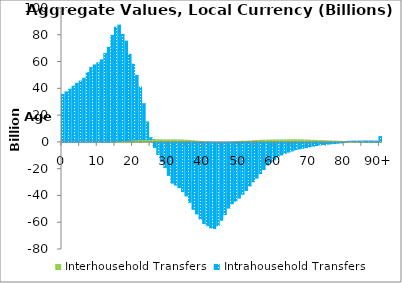
| Category | Interhousehold Transfers | Intrahousehold Transfers |
|---|---|---|
| 0 | 0 | 35751.461 |
|  | 0 | 37716.312 |
| 2 | 0 | 39720.947 |
| 3 | 0 | 41975.771 |
| 4 | 0 | 44111.616 |
| 5 | 0 | 45813.739 |
| 6 | 0 | 47883.233 |
| 7 | 0 | 52155.057 |
| 8 | 0 | 55840.398 |
| 9 | 0 | 57887.775 |
| 10 | 0 | 59434.502 |
| 11 | 0 | 61644.762 |
| 12 | 58.125 | 66401.333 |
| 13 | 124.232 | 70904.792 |
| 14 | 264.367 | 79694.11 |
| 15 | 475.03 | 85583.53 |
| 16 | 754.646 | 86840.67 |
| 17 | 1024.36 | 79652.402 |
| 18 | 1270.335 | 74351.024 |
| 19 | 1542.965 | 64181.14 |
| 20 | 1822.283 | 56574.491 |
| 21 | 1998.437 | 48045.274 |
| 22 | 2088.601 | 39201.676 |
| 23 | 2126.765 | 26825.713 |
| 24 | 2137.882 | 13123.959 |
| 25 | 2136.284 | 1372.672 |
| 26 | 2103.991 | -3740.96 |
| 27 | 2036.01 | -9044.374 |
| 28 | 1952.44 | -14371.701 |
| 29 | 1886.834 | -18816.327 |
| 30 | 1894.533 | -24655.974 |
| 31 | 1923.094 | -30453.542 |
| 32 | 1945.813 | -31866.468 |
| 33 | 1895.992 | -33776.305 |
| 34 | 1779.383 | -36861.793 |
| 35 | 1611.6 | -39966.27 |
| 36 | 1396.141 | -44759.56 |
| 37 | 1189.053 | -49996.827 |
| 38 | 966.732 | -53442.011 |
| 39 | 743.058 | -57203.286 |
| 40 | 524.325 | -60557.508 |
| 41 | 320.459 | -62305.343 |
| 42 | 121.139 | -63828.501 |
| 43 | -46.424 | -64293.731 |
| 44 | -223.651 | -61963.952 |
| 45 | -258.642 | -57867.063 |
| 46 | -229.216 | -53713.797 |
| 47 | -135.487 | -48960.028 |
| 48 | 155.968 | -45837.471 |
| 49 | 487.472 | -43951.106 |
| 50 | 734.287 | -41572.851 |
| 51 | 881.889 | -38720.251 |
| 52 | 917.92 | -35922.333 |
| 53 | 1047.701 | -32594.155 |
| 54 | 1285.048 | -29425.33 |
| 55 | 1462.851 | -26736.661 |
| 56 | 1563.59 | -23272.284 |
| 57 | 1657.888 | -20261.231 |
| 58 | 1694.879 | -17003.79 |
| 59 | 1772.875 | -14664.042 |
| 60 | 1841.397 | -12990.553 |
| 61 | 1850.186 | -10761.704 |
| 62 | 1858.642 | -9364.617 |
| 63 | 1908.816 | -8172.195 |
| 64 | 1942.195 | -7273.956 |
| 65 | 1970.342 | -6434.402 |
| 66 | 1982.346 | -5514.53 |
| 67 | 1966.604 | -4870.673 |
| 68 | 1919.23 | -4419.805 |
| 69 | 1823.321 | -3882.075 |
| 70 | 1677.752 | -3333.879 |
| 71 | 1560.036 | -2812.251 |
| 72 | 1477.089 | -2365.075 |
| 73 | 1381.024 | -1904.535 |
| 74 | 1274.751 | -1625.847 |
| 75 | 1195.482 | -1368.931 |
| 76 | 1097.444 | -1137.443 |
| 77 | 993.354 | -894.888 |
| 78 | 882.611 | -639.967 |
| 79 | 766.977 | -349.947 |
| 80 | 676.438 | -38.301 |
| 81 | 572.006 | 236.699 |
| 82 | 493.631 | 435.41 |
| 83 | 406.166 | 570.078 |
| 84 | 326.665 | 645.395 |
| 85 | 289.849 | 749.591 |
| 86 | 255.06 | 838.524 |
| 87 | 209.048 | 875.104 |
| 88 | 175.647 | 881.316 |
| 89 | 140.283 | 830.083 |
| 90+ | 545.763 | 3811.839 |